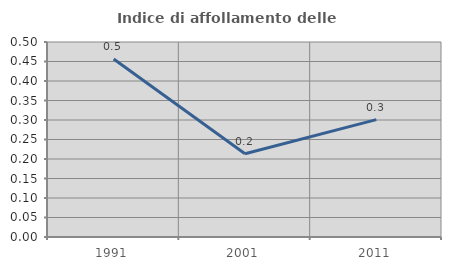
| Category | Indice di affollamento delle abitazioni  |
|---|---|
| 1991.0 | 0.456 |
| 2001.0 | 0.214 |
| 2011.0 | 0.301 |